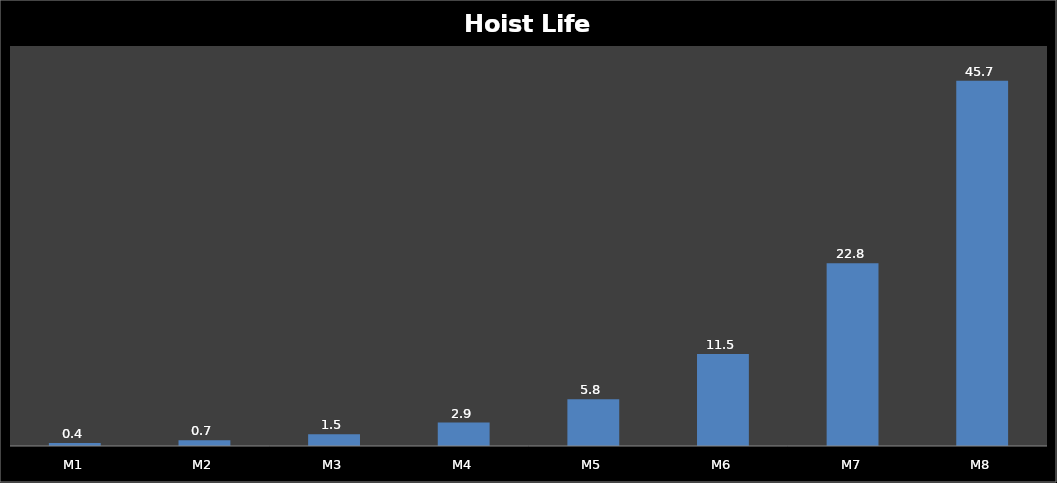
| Category | Series 0 |
|---|---|
| M1 | 0.365 |
| M2 | 0.731 |
| M3 | 1.461 |
| M4 | 2.922 |
| M5 | 5.845 |
| M6 | 11.507 |
| M7 | 22.831 |
| M8 | 45.662 |